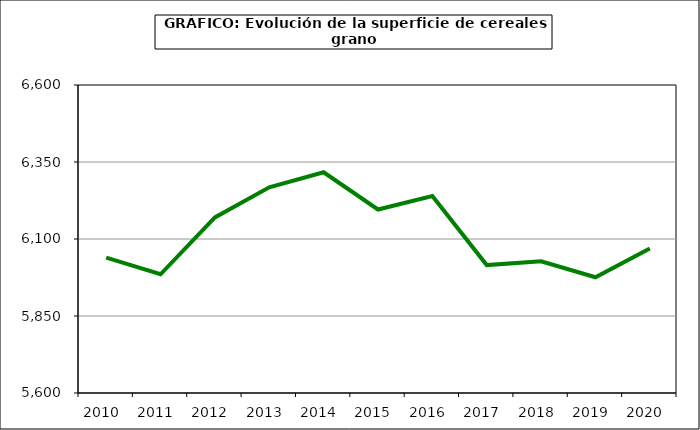
| Category | Superficie |
|---|---|
| 2010.0 | 6039.789 |
| 2011.0 | 5985.492 |
| 2012.0 | 6170.107 |
| 2013.0 | 6268.026 |
| 2014.0 | 6316.794 |
| 2015.0 | 6195.859 |
| 2016.0 | 6239.8 |
| 2017.0 | 6015.231 |
| 2018.0 | 6027.848 |
| 2019.0 | 5975.712 |
| 2020.0 | 6069.237 |